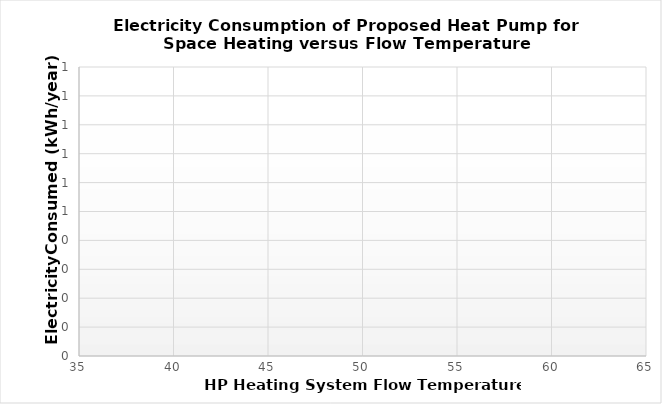
| Category | Series 0 |
|---|---|
| 35.0 | 0 |
| 36.0 | 0 |
| 37.0 | 0 |
| 38.0 | 0 |
| 39.0 | 0 |
| 40.0 | 0 |
| 41.0 | 0 |
| 42.0 | 0 |
| 43.0 | 0 |
| 44.0 | 0 |
| 45.0 | 0 |
| 46.0 | 0 |
| 47.0 | 0 |
| 48.0 | 0 |
| 49.0 | 0 |
| 50.0 | 0 |
| 51.0 | 0 |
| 52.0 | 0 |
| 53.0 | 0 |
| 54.0 | 0 |
| 55.0 | 0 |
| 56.0 | 0 |
| 57.0 | 0 |
| 58.0 | 0 |
| 59.0 | 0 |
| 60.0 | 0 |
| 61.0 | 0 |
| 62.0 | 0 |
| 63.0 | 0 |
| 64.0 | 0 |
| 65.0 | 0 |